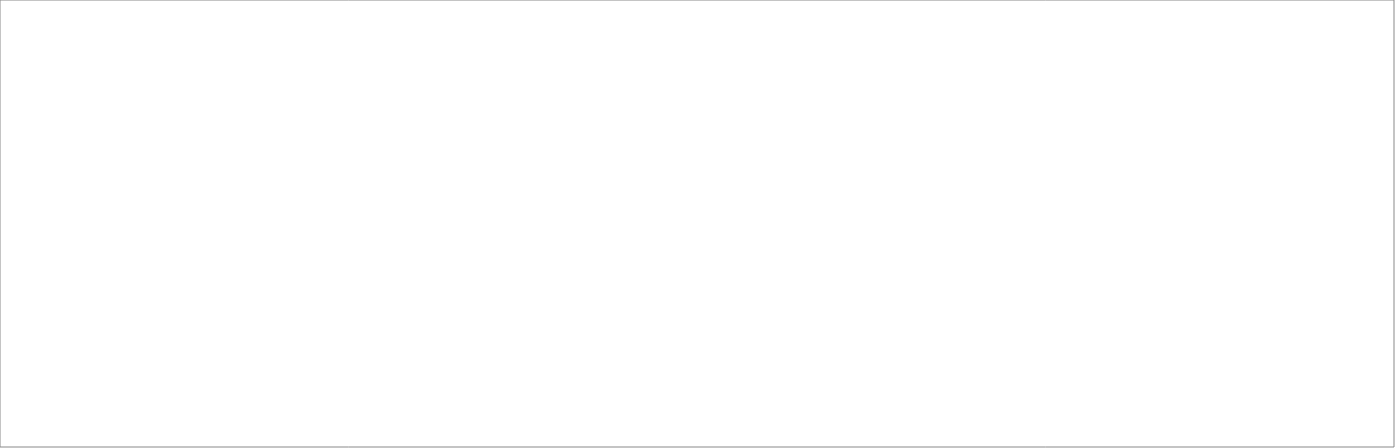
| Category | Otras actividades de servicios comunitarios, sociales y personales |
|---|---|
| 2018_I | 999.371 |
| 2018_II | 1068.125 |
| 2018_III | 1086.859 |
| 2018_IV | 1138.629 |
| 2019_I | 1037.611 |
| 2019_II | 1135.977 |
| 2019_III | 0 |
| 2019_IV | 0 |